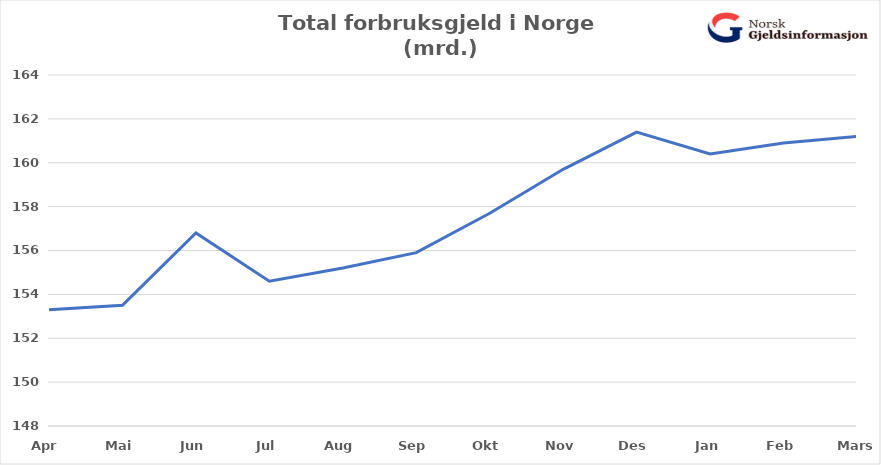
| Category | Total usikret gjeld (mrd) |
|---|---|
| Apr | 153.3 |
| Mai | 153.5 |
| Jun | 156.8 |
| Jul | 154.6 |
| Aug | 155.2 |
| Sep | 155.9 |
| Okt | 157.7 |
| Nov | 159.7 |
| Des | 161.4 |
| Jan | 160.4 |
| Feb | 160.9 |
| Mars | 161.2 |